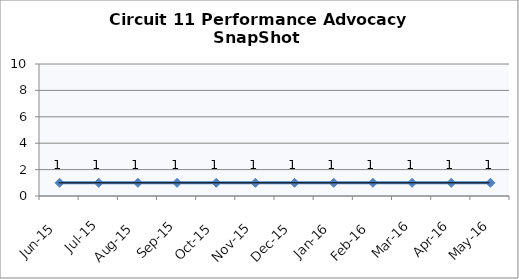
| Category | Circuit 11 |
|---|---|
| Jun-15 | 1 |
| Jul-15 | 1 |
| Aug-15 | 1 |
| Sep-15 | 1 |
| Oct-15 | 1 |
| Nov-15 | 1 |
| Dec-15 | 1 |
| Jan-16 | 1 |
| Feb-16 | 1 |
| Mar-16 | 1 |
| Apr-16 | 1 |
| May-16 | 1 |